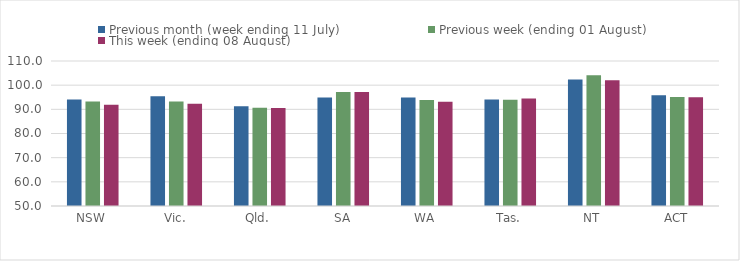
| Category | Previous month (week ending 11 July) | Previous week (ending 01 August) | This week (ending 08 August) |
|---|---|---|---|
| NSW | 94.019 | 93.207 | 91.948 |
| Vic. | 95.374 | 93.223 | 92.312 |
| Qld. | 91.313 | 90.612 | 90.506 |
| SA | 94.918 | 97.169 | 97.195 |
| WA | 94.885 | 93.882 | 93.181 |
| Tas. | 94.046 | 93.946 | 94.486 |
| NT | 102.36 | 104.13 | 102 |
| ACT | 95.825 | 95.058 | 95.05 |